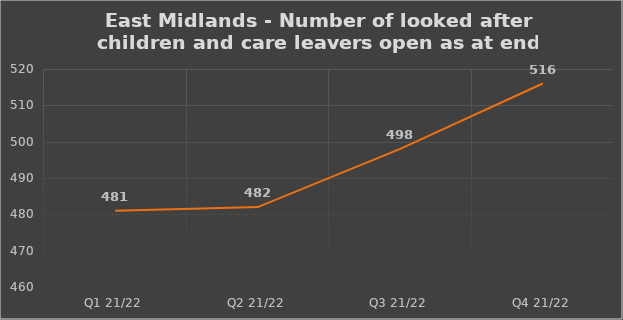
| Category | Number of open cases  |
|---|---|
| Q1 21/22 | 481 |
| Q2 21/22 | 482 |
| Q3 21/22 | 498 |
| Q4 21/22 | 516 |